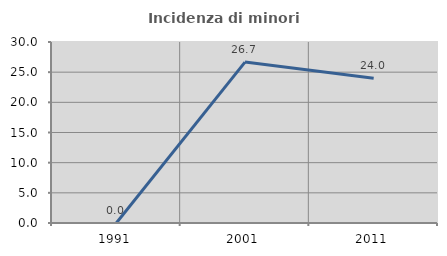
| Category | Incidenza di minori stranieri |
|---|---|
| 1991.0 | 0 |
| 2001.0 | 26.667 |
| 2011.0 | 24 |